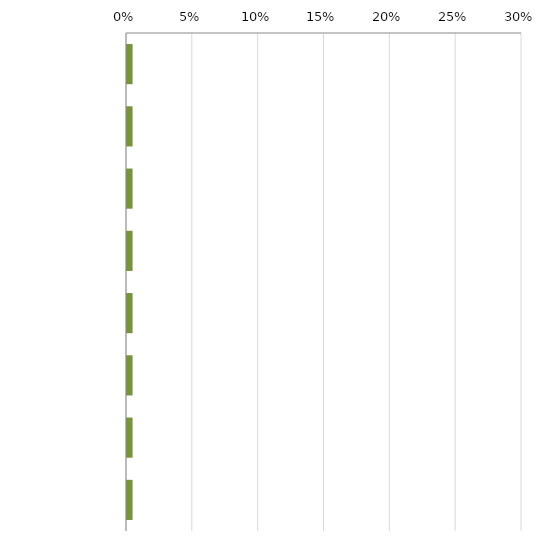
| Category | Series 0 | Series 1 |
|---|---|---|
|  | 0 | 0.005 |
|  | 0 | 0.005 |
|  | 0 | 0.005 |
|  | 0 | 0.005 |
|  | 0 | 0.005 |
|                                   | 0 | 0.005 |